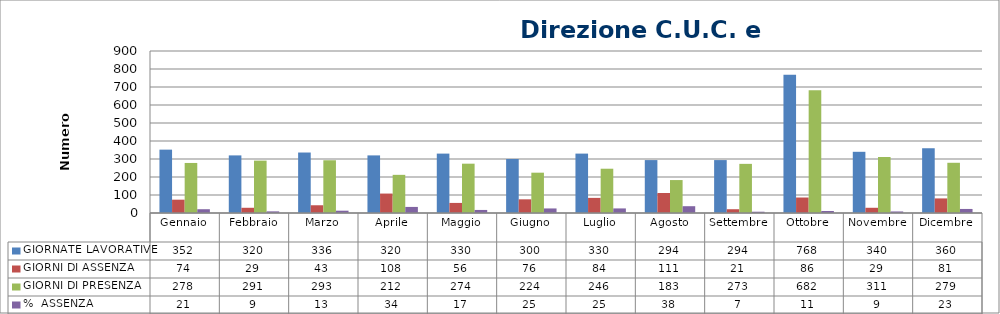
| Category | GIORNATE LAVORATIVE | GIORNI DI ASSENZA | GIORNI DI PRESENZA | %  ASSENZA |
|---|---|---|---|---|
| Gennaio | 352 | 74 | 278 | 21.023 |
| Febbraio | 320 | 29 | 291 | 9.062 |
| Marzo | 336 | 43 | 293 | 12.798 |
| Aprile | 320 | 108 | 212 | 33.75 |
| Maggio | 330 | 56 | 274 | 16.97 |
| Giugno | 300 | 76 | 224 | 25.333 |
| Luglio | 330 | 84 | 246 | 25.455 |
| Agosto | 294 | 111 | 183 | 37.755 |
| Settembre | 294 | 21 | 273 | 7.143 |
| Ottobre | 768 | 86 | 682 | 11.198 |
| Novembre | 340 | 29 | 311 | 8.529 |
| Dicembre | 360 | 81 | 279 | 22.5 |